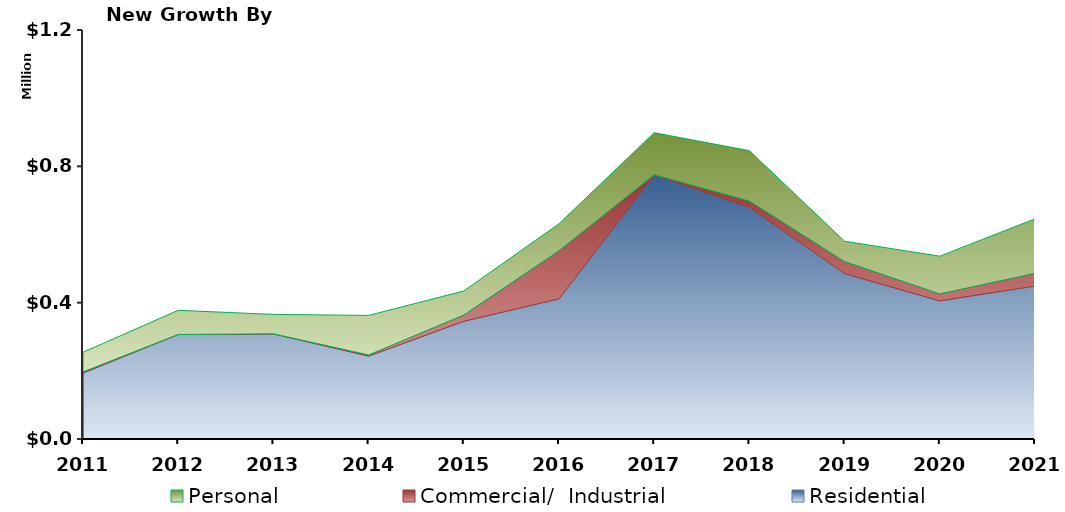
| Category | Residential | Commercial/  Industrial | Personal |
|---|---|---|---|
| 2011.0 | 193334 | 3584 | 57536 |
| 2012.0 | 306622 | 19 | 70905 |
| 2013.0 | 308576 | 0 | 57020 |
| 2014.0 | 243122 | 3567 | 115860 |
| 2015.0 | 345362 | 18317 | 70595 |
| 2016.0 | 411225 | 140977 | 79274 |
| 2017.0 | 774391 | 917 | 123299 |
| 2018.0 | 679363 | 18786 | 147774 |
| 2019.0 | 485214 | 35311 | 59710 |
| 2020.0 | 405211 | 20552 | 110600 |
| 2021.0 | 448672 | 37578 | 159883 |